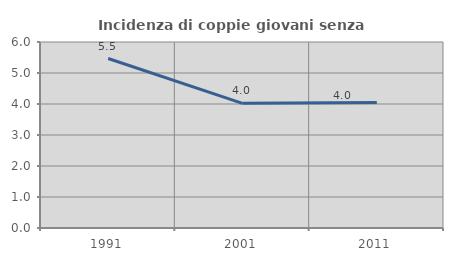
| Category | Incidenza di coppie giovani senza figli |
|---|---|
| 1991.0 | 5.468 |
| 2001.0 | 4.022 |
| 2011.0 | 4.047 |